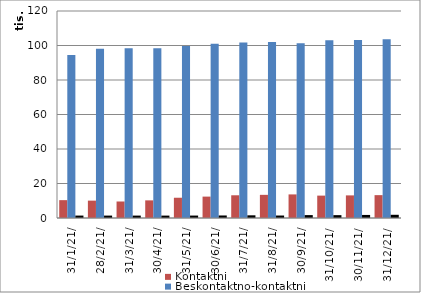
| Category | Kontaktni | Beskontaktno-kontaktni | Beskontaktni |
|---|---|---|---|
| 2021-01-31 | 10348 | 94449 | 1407 |
| 2021-02-28 | 10070 | 98152 | 1396 |
| 2021-03-31 | 9571 | 98467 | 1397 |
| 2021-04-30 | 10225 | 98416 | 1392 |
| 2021-05-31 | 11748 | 99656 | 1412 |
| 2021-06-30 | 12403 | 100981 | 1462 |
| 2021-07-31 | 13170 | 101798 | 1555 |
| 2021-08-31 | 13424 | 101991 | 1435 |
| 2021-09-30 | 13676 | 101342 | 1680 |
| 2021-10-31 | 12978 | 103000 | 1653 |
| 2021-11-30 | 13110 | 103180 | 1774 |
| 2021-12-31 | 13253 | 103615 | 1863 |